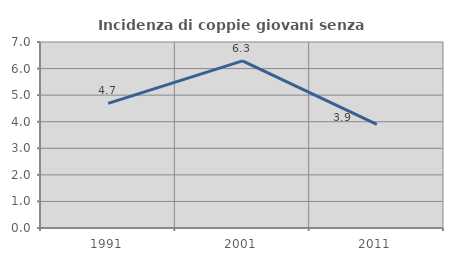
| Category | Incidenza di coppie giovani senza figli |
|---|---|
| 1991.0 | 4.69 |
| 2001.0 | 6.287 |
| 2011.0 | 3.901 |